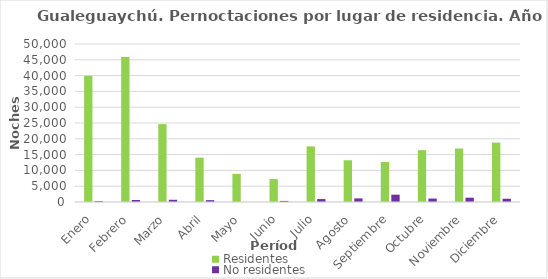
| Category | Residentes | No residentes |
|---|---|---|
| Enero | 39947 | 290 |
| Febrero | 45869 | 629 |
| Marzo | 24639 | 709 |
| Abril | 14027 | 586 |
| Mayo | 8910 | 0 |
| Junio | 7261 | 345 |
| Julio | 17593 | 921 |
| Agosto | 13207 | 1142 |
| Septiembre | 12665 | 2319 |
| Octubre | 16407 | 1083 |
| Noviembre | 16921 | 1360 |
| Diciembre | 18794 | 1029 |